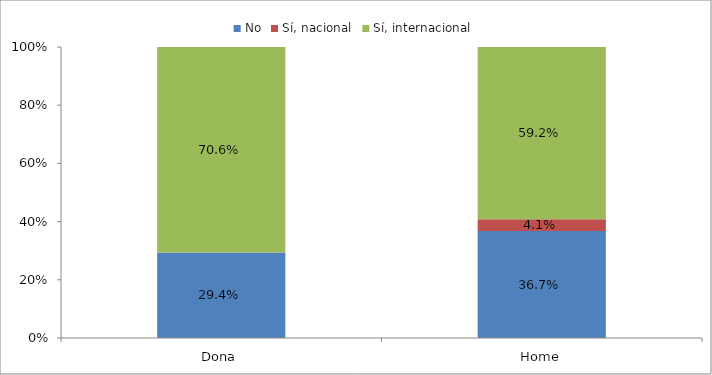
| Category | No | Sí, nacional | Sí, internacional |
|---|---|---|---|
| Dona | 0.294 | 0 | 0.706 |
| Home | 0.367 | 0.041 | 0.592 |